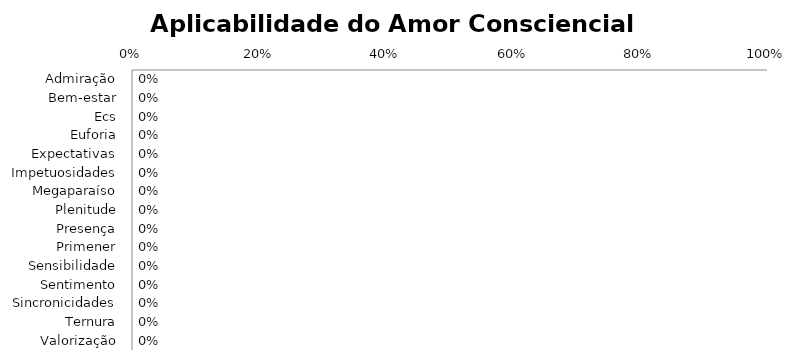
| Category | Series 0 |
|---|---|
| Admiração | 0 |
| Bem-estar | 0 |
| Ecs | 0 |
| Euforia | 0 |
| Expectativas | 0 |
| Impetuosidades | 0 |
| Megaparaíso | 0 |
| Plenitude | 0 |
| Presença | 0 |
| Primener | 0 |
| Sensibilidade | 0 |
| Sentimento | 0 |
| Sincronicidades | 0 |
| Ternura | 0 |
| Valorização | 0 |